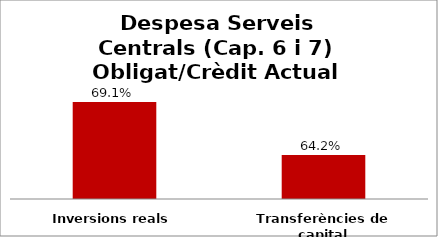
| Category | Series 0 |
|---|---|
| Inversions reals | 0.691 |
| Transferències de capital | 0.642 |